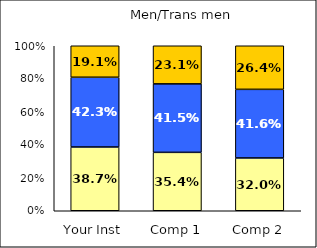
| Category | Low Social Self-Concept | Average Social Self-Concept | High Social Self-Concept |
|---|---|---|---|
| Your Inst | 0.387 | 0.423 | 0.191 |
| Comp 1 | 0.354 | 0.415 | 0.231 |
| Comp 2 | 0.32 | 0.416 | 0.264 |